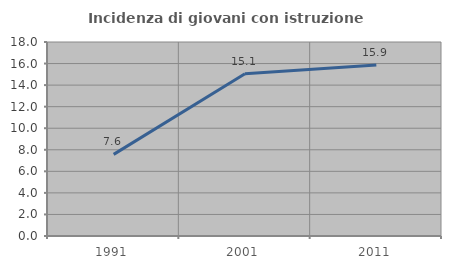
| Category | Incidenza di giovani con istruzione universitaria |
|---|---|
| 1991.0 | 7.576 |
| 2001.0 | 15.054 |
| 2011.0 | 15.873 |